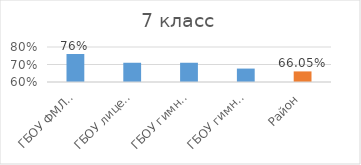
| Category | Series 0 |
|---|---|
| ГБОУ ФМЛ №366 | 0.76 |
| ГБОУ лицей №373 | 0.71 |
| ГБОУ гимназия №524 | 0.71 |
| ГБОУ гимназия №526 | 0.677 |
| Район | 0.66 |